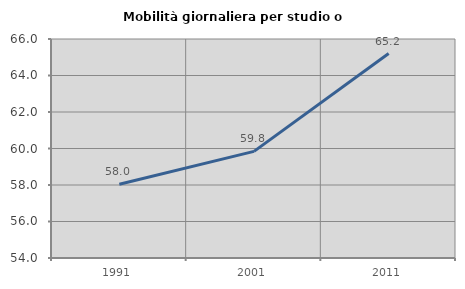
| Category | Mobilità giornaliera per studio o lavoro |
|---|---|
| 1991.0 | 58.044 |
| 2001.0 | 59.842 |
| 2011.0 | 65.201 |